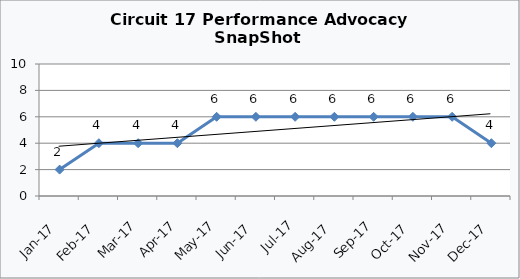
| Category | Circuit 17 |
|---|---|
| Jan-17 | 2 |
| Feb-17 | 4 |
| Mar-17 | 4 |
| Apr-17 | 4 |
| May-17 | 6 |
| Jun-17 | 6 |
| Jul-17 | 6 |
| Aug-17 | 6 |
| Sep-17 | 6 |
| Oct-17 | 6 |
| Nov-17 | 6 |
| Dec-17 | 4 |